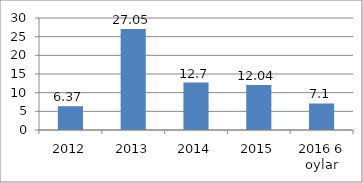
| Category | Series 0 |
|---|---|
| 2012 | 6.37 |
| 2013 | 27.05 |
| 2014 | 12.7 |
| 2015 | 12.04 |
| 2016 6 oylar | 7.1 |